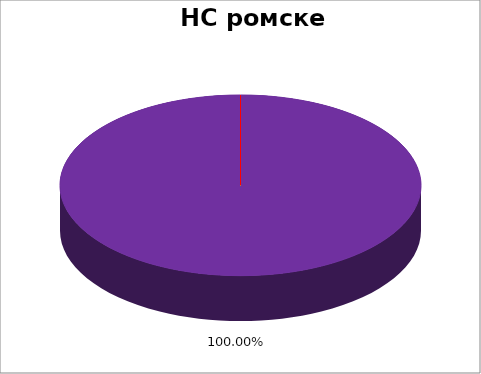
| Category | НС ромске НМ |
|---|---|
| 0 | 0 |
| 1 | 0 |
| 2 | 0 |
| 3 | 0 |
| 4 | 1 |